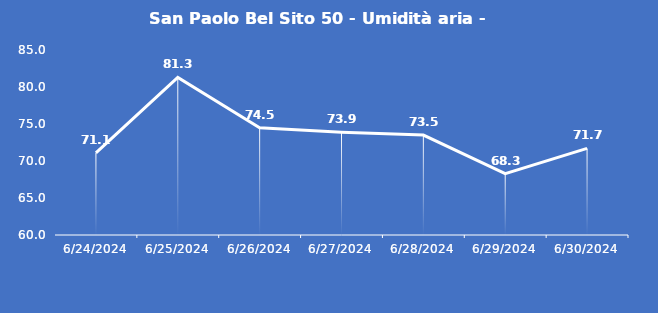
| Category | San Paolo Bel Sito 50 - Umidità aria - Grezzo (%) |
|---|---|
| 6/24/24 | 71.1 |
| 6/25/24 | 81.3 |
| 6/26/24 | 74.5 |
| 6/27/24 | 73.9 |
| 6/28/24 | 73.5 |
| 6/29/24 | 68.3 |
| 6/30/24 | 71.7 |